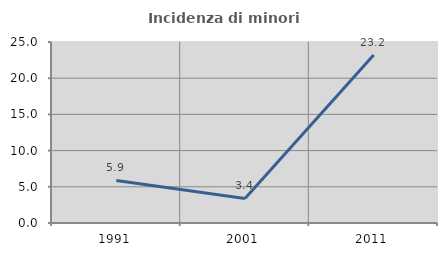
| Category | Incidenza di minori stranieri |
|---|---|
| 1991.0 | 5.882 |
| 2001.0 | 3.39 |
| 2011.0 | 23.214 |